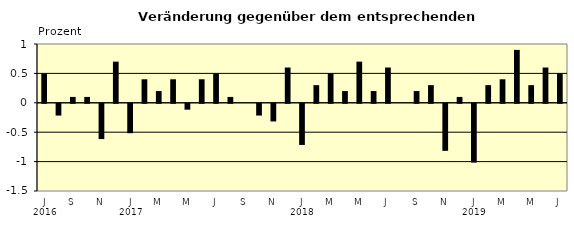
| Category | Series 0 |
|---|---|
| 0 | 0.5 |
| 1 | -0.2 |
| 2 | 0.1 |
| 3 | 0.1 |
| 4 | -0.6 |
| 5 | 0.7 |
| 6 | -0.5 |
| 7 | 0.4 |
| 8 | 0.2 |
| 9 | 0.4 |
| 10 | -0.1 |
| 11 | 0.4 |
| 12 | 0.5 |
| 13 | 0.1 |
| 14 | 0 |
| 15 | -0.2 |
| 16 | -0.3 |
| 17 | 0.6 |
| 18 | -0.7 |
| 19 | 0.3 |
| 20 | 0.5 |
| 21 | 0.2 |
| 22 | 0.7 |
| 23 | 0.2 |
| 24 | 0.6 |
| 25 | 0 |
| 26 | 0.2 |
| 27 | 0.3 |
| 28 | -0.8 |
| 29 | 0.1 |
| 30 | -1 |
| 31 | 0.3 |
| 32 | 0.4 |
| 33 | 0.9 |
| 34 | 0.3 |
| 35 | 0.6 |
| 36 | 0.5 |